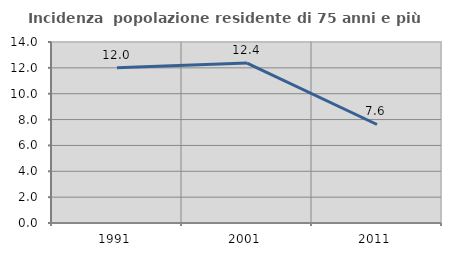
| Category | Incidenza  popolazione residente di 75 anni e più |
|---|---|
| 1991.0 | 12 |
| 2001.0 | 12.371 |
| 2011.0 | 7.619 |